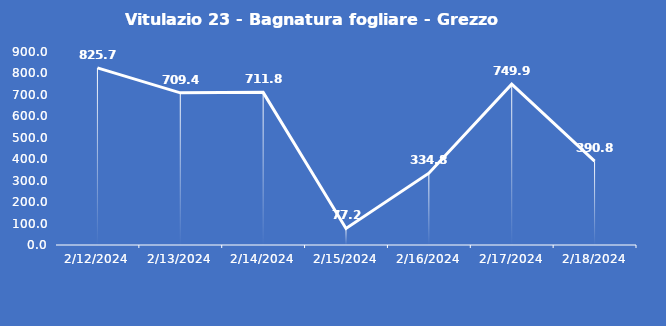
| Category | Vitulazio 23 - Bagnatura fogliare - Grezzo (min) |
|---|---|
| 2/12/24 | 825.7 |
| 2/13/24 | 709.4 |
| 2/14/24 | 711.8 |
| 2/15/24 | 77.2 |
| 2/16/24 | 334.8 |
| 2/17/24 | 749.9 |
| 2/18/24 | 390.8 |